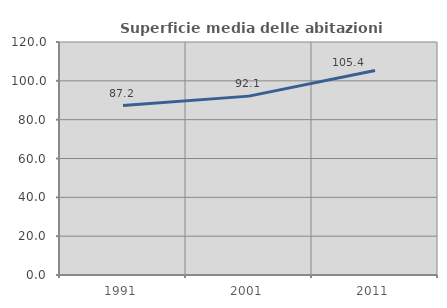
| Category | Superficie media delle abitazioni occupate |
|---|---|
| 1991.0 | 87.248 |
| 2001.0 | 92.126 |
| 2011.0 | 105.353 |